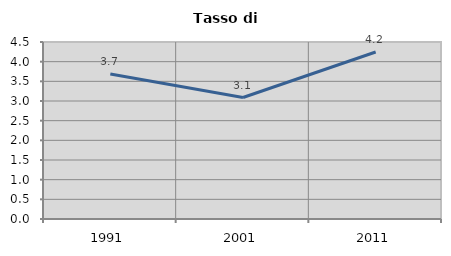
| Category | Tasso di disoccupazione   |
|---|---|
| 1991.0 | 3.686 |
| 2001.0 | 3.089 |
| 2011.0 | 4.247 |